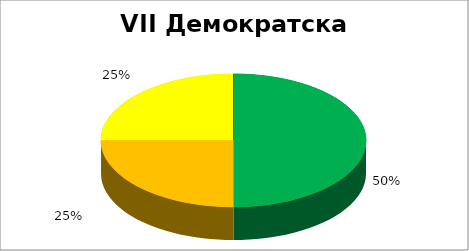
| Category | VII Демократска партиципација |
|---|---|
| 0 | 0.5 |
| 1 | 0.25 |
| 2 | 0.25 |
| 3 | 0 |
| 4 | 0 |